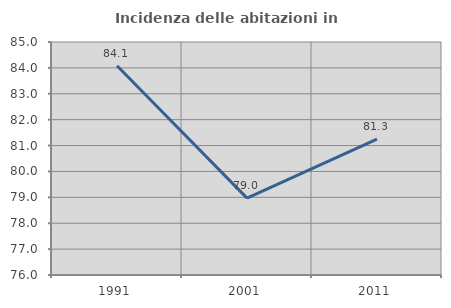
| Category | Incidenza delle abitazioni in proprietà  |
|---|---|
| 1991.0 | 84.082 |
| 2001.0 | 78.97 |
| 2011.0 | 81.25 |